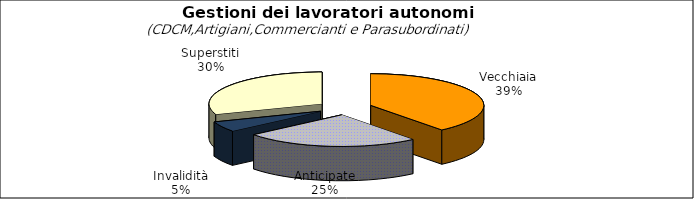
| Category | Series 0 |
|---|---|
| Vecchiaia | 90837 |
| Anticipate | 58056 |
| Invalidità | 12278 |
| Superstiti | 70687 |